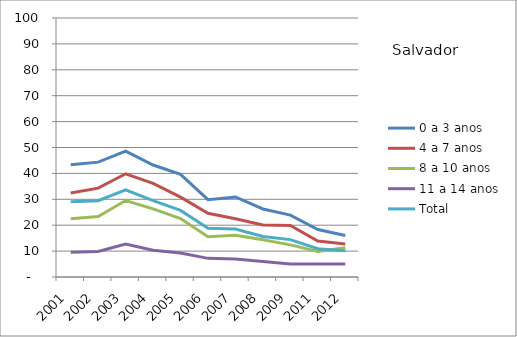
| Category | 0 a 3 anos | 4 a 7 anos | 8 a 10 anos | 11 a 14 anos | Total |
|---|---|---|---|---|---|
| 2001.0 | 43.37 | 32.44 | 22.46 | 9.57 | 29.05 |
| 2002.0 | 44.35 | 34.31 | 23.36 | 9.89 | 29.45 |
| 2003.0 | 48.62 | 39.86 | 29.53 | 12.7 | 33.67 |
| 2004.0 | 43.24 | 36.16 | 26.28 | 10.35 | 29.52 |
| 2005.0 | 39.6 | 30.84 | 22.57 | 9.29 | 25.71 |
| 2006.0 | 29.87 | 24.61 | 15.55 | 7.2 | 18.83 |
| 2007.0 | 30.91 | 22.47 | 16.09 | 6.97 | 18.5 |
| 2008.0 | 26.26 | 20.12 | 14.35 | 5.99 | 15.66 |
| 2009.0 | 23.88 | 19.92 | 12.41 | 5.03 | 14.43 |
| 2011.0 | 18.34 | 13.92 | 9.83 | 5.02 | 10.92 |
| 2012.0 | 16.04 | 12.72 | 11.33 | 5.02 | 10.09 |